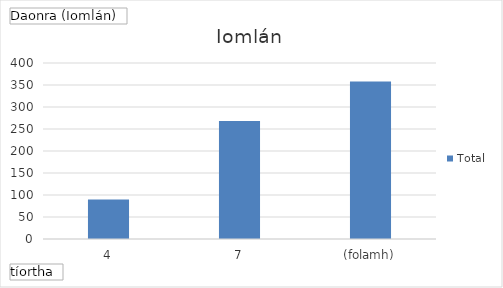
| Category | Total |
|---|---|
| 4 | 90 |
| 7 | 268 |
| (folamh) | 358 |